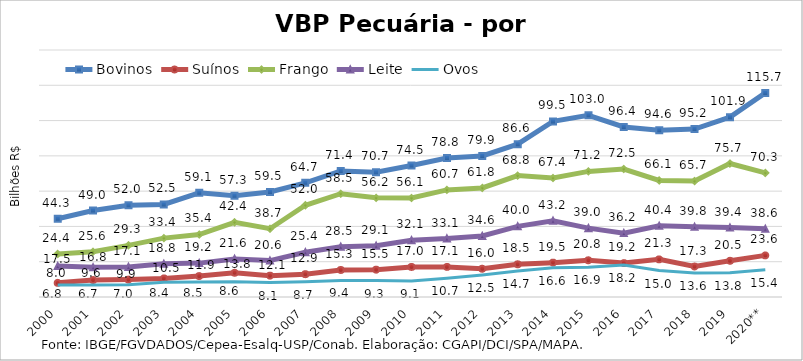
| Category | Bovinos | Suínos | Frango | Leite | Ovos |
|---|---|---|---|---|---|
| 2000 | 44.331 | 8.027 | 24.393 | 17.51 | 6.846 |
| 2001 | 49.003 | 9.63 | 25.639 | 16.85 | 6.747 |
| 2002 | 52.002 | 9.87 | 29.266 | 17.062 | 6.951 |
| 2003 | 52.483 | 10.548 | 33.366 | 18.789 | 8.408 |
| 2004 | 59.05 | 11.86 | 35.43 | 19.203 | 8.521 |
| 2005 | 57.329 | 13.75 | 42.359 | 21.598 | 8.579 |
| 2006 | 59.522 | 12.095 | 38.697 | 20.63 | 8.15 |
| 2007 | 64.686 | 12.934 | 51.993 | 25.361 | 8.661 |
| 2008 | 71.421 | 15.315 | 58.527 | 28.53 | 9.354 |
| 2009 | 70.676 | 15.481 | 56.194 | 29.086 | 9.327 |
| 2010 | 74.514 | 17.03 | 56.126 | 32.122 | 9.071 |
| 2011 | 78.773 | 17.057 | 60.704 | 33.114 | 10.689 |
| 2012 | 79.947 | 16.016 | 61.837 | 34.603 | 12.53 |
| 2013 | 86.635 | 18.544 | 68.825 | 40.042 | 14.737 |
| 2014 | 99.527 | 19.477 | 67.433 | 43.24 | 16.558 |
| 2015 | 102.953 | 20.815 | 71.188 | 39.031 | 16.859 |
| 2016 | 96.369 | 19.209 | 72.536 | 36.217 | 18.175 |
| 2017 | 94.569 | 21.324 | 66.067 | 40.353 | 14.981 |
| 2018 | 95.203 | 17.269 | 65.707 | 39.753 | 13.623 |
| 2019 | 101.941 | 20.527 | 75.655 | 39.385 | 13.796 |
| 2020** | 115.663 | 23.584 | 70.308 | 38.63 | 15.423 |